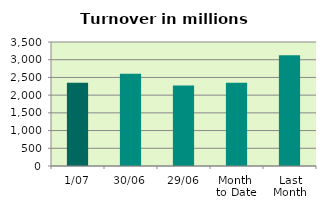
| Category | Series 0 |
|---|---|
| 1/07 | 2348.272 |
| 30/06 | 2602.557 |
| 29/06 | 2273.937 |
| Month 
to Date | 2348.272 |
| Last
Month | 3125.165 |